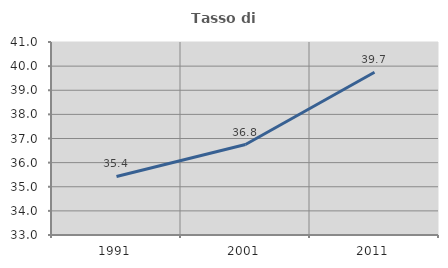
| Category | Tasso di occupazione   |
|---|---|
| 1991.0 | 35.428 |
| 2001.0 | 36.751 |
| 2011.0 | 39.748 |